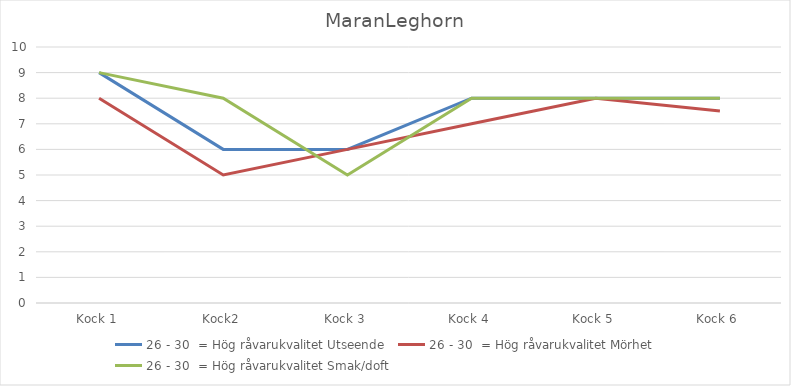
| Category | 26 - 30  = Hög råvarukvalitet Utseende | 26 - 30  = Hög råvarukvalitet Mörhet | 26 - 30  = Hög råvarukvalitet Smak/doft |
|---|---|---|---|
| Kock 1 | 9 | 8 | 9 |
| Kock2 | 6 | 5 | 8 |
| Kock 3 | 6 | 6 | 5 |
| Kock 4 | 8 | 7 | 8 |
| Kock 5 | 8 | 8 | 8 |
| Kock 6 | 8 | 7.5 | 8 |